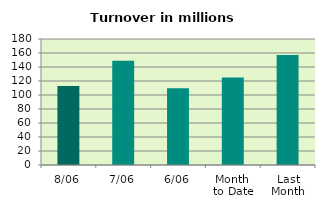
| Category | Series 0 |
|---|---|
| 8/06 | 112.759 |
| 7/06 | 148.767 |
| 6/06 | 109.696 |
| Month 
to Date | 124.832 |
| Last
Month | 157.265 |